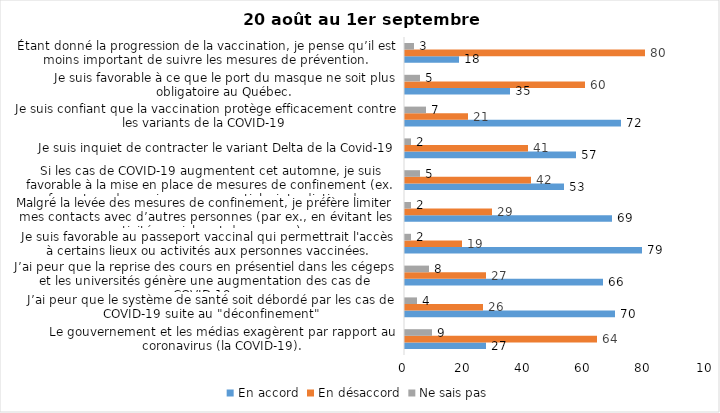
| Category | En accord | En désaccord | Ne sais pas |
|---|---|---|---|
| Le gouvernement et les médias exagèrent par rapport au coronavirus (la COVID-19). | 27 | 64 | 9 |
| J’ai peur que le système de santé soit débordé par les cas de COVID-19 suite au "déconfinement" | 70 | 26 | 4 |
| J’ai peur que la reprise des cours en présentiel dans les cégeps et les universités génère une augmentation des cas de COVID-19. | 66 | 27 | 8 |
| Je suis favorable au passeport vaccinal qui permettrait l'accès à certains lieux ou activités aux personnes vaccinées. | 79 | 19 | 2 |
| Malgré la levée des mesures de confinement, je préfère limiter mes contacts avec d’autres personnes (par ex., en évitant les activités sociales et de groupes) | 69 | 29 | 2 |
| Si les cas de COVID-19 augmentent cet automne, je suis favorable à la mise en place de mesures de confinement (ex. fermeture de services non essentiels, interdiction des rassemblements privés) | 53 | 42 | 5 |
| Je suis inquiet de contracter le variant Delta de la Covid-19 | 57 | 41 | 2 |
| Je suis confiant que la vaccination protège efficacement contre les variants de la COVID-19 | 72 | 21 | 7 |
| Je suis favorable à ce que le port du masque ne soit plus obligatoire au Québec. | 35 | 60 | 5 |
| Étant donné la progression de la vaccination, je pense qu’il est moins important de suivre les mesures de prévention. | 18 | 80 | 3 |